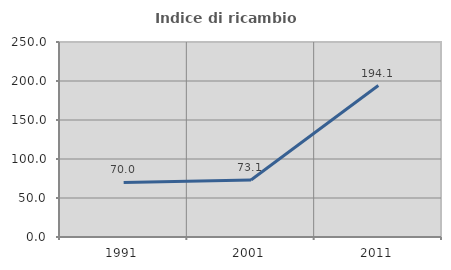
| Category | Indice di ricambio occupazionale  |
|---|---|
| 1991.0 | 70 |
| 2001.0 | 73.148 |
| 2011.0 | 194.144 |